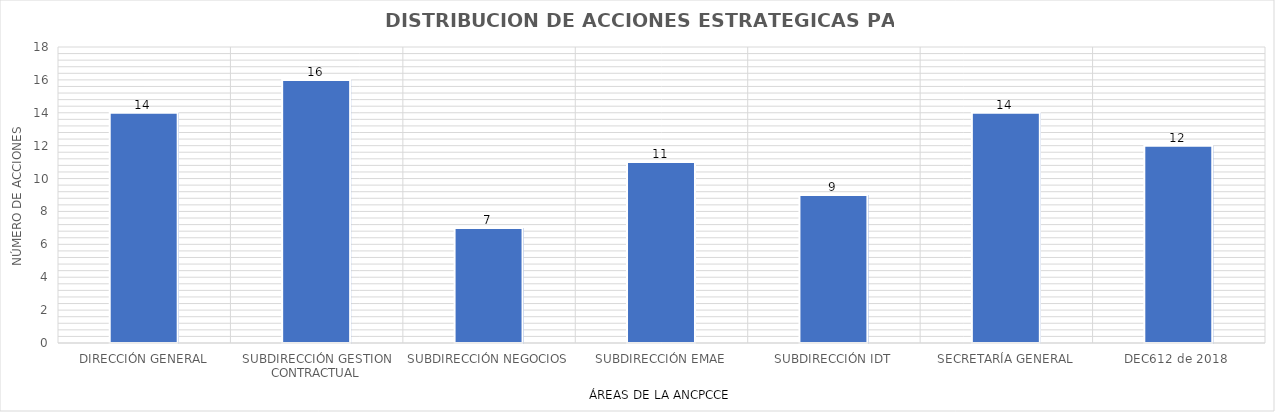
| Category | Series 0 |
|---|---|
| DIRECCIÓN GENERAL | 14 |
| SUBDIRECCIÓN GESTION CONTRACTUAL | 16 |
| SUBDIRECCIÓN NEGOCIOS | 7 |
| SUBDIRECCIÓN EMAE | 11 |
| SUBDIRECCIÓN IDT | 9 |
| SECRETARÍA GENERAL | 14 |
| DEC612 de 2018  | 12 |